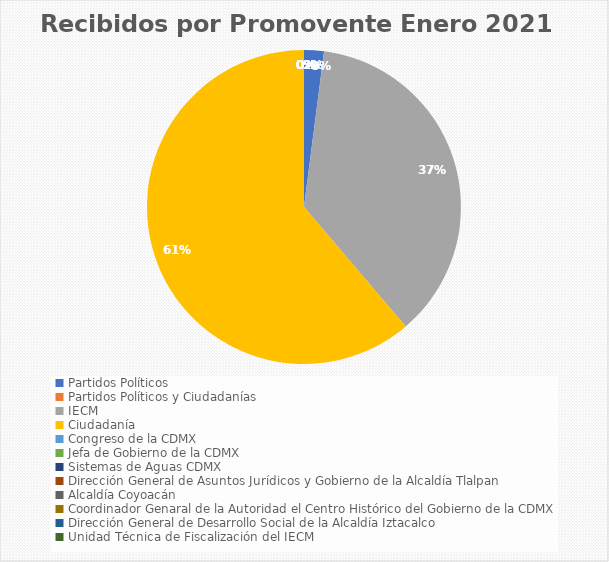
| Category | Recibidos por Promovente Enero |
|---|---|
| Partidos Políticos | 1 |
| Partidos Políticos y Ciudadanías | 0 |
| IECM | 18 |
| Ciudadanía  | 30 |
| Congreso de la CDMX | 0 |
| Jefa de Gobierno de la CDMX | 0 |
| Sistemas de Aguas CDMX | 0 |
| Dirección General de Asuntos Jurídicos y Gobierno de la Alcaldía Tlalpan | 0 |
| Alcaldía Coyoacán | 0 |
| Coordinador Genaral de la Autoridad el Centro Histórico del Gobierno de la CDMX | 0 |
| Dirección General de Desarrollo Social de la Alcaldía Iztacalco | 0 |
| Unidad Técnica de Fiscalización del IECM | 0 |